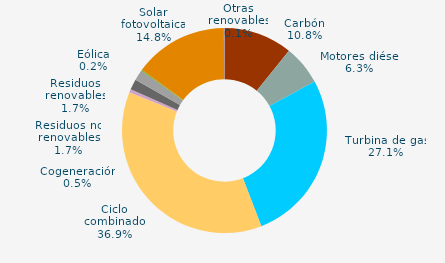
| Category | Series 0 |
|---|---|
| Carbón | 10.824 |
| Motores diésel | 6.256 |
| Turbina de gas | 27.064 |
| Ciclo combinado | 36.927 |
| Generación auxiliar | 0 |
| Cogeneración | 0.517 |
| Residuos no renovables | 1.678 |
| Residuos renovables | 1.678 |
| Eólica | 0.16 |
| Solar fotovoltaica | 14.8 |
| Otras renovables | 0.096 |